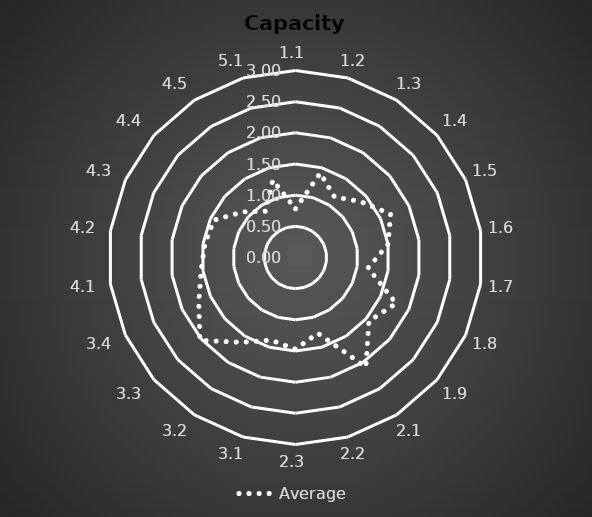
| Category | Average |
|---|---|
| 1.1 | 0.781 |
| 1.2 | 1.412 |
| 1.3 | 1.156 |
| 1.4 | 1.373 |
| 1.5 | 1.676 |
| 1.6 | 1.5 |
| 1.7 | 1.176 |
| 1.8 | 1.775 |
| 1.9 | 1.559 |
| 2.1 | 2.088 |
| 2.2 | 1.265 |
| 2.3 | 1.471 |
| 3.1 | 1.382 |
| 3.2 | 1.618 |
| 3.3 | 2.029 |
| 3.4 | 1.706 |
| 4.1 | 1.529 |
| 4.2 | 1.471 |
| 4.3 | 1.441 |
| 4.4 | 1.118 |
| 4.5 | 0.882 |
| 5.1 | 1.294 |